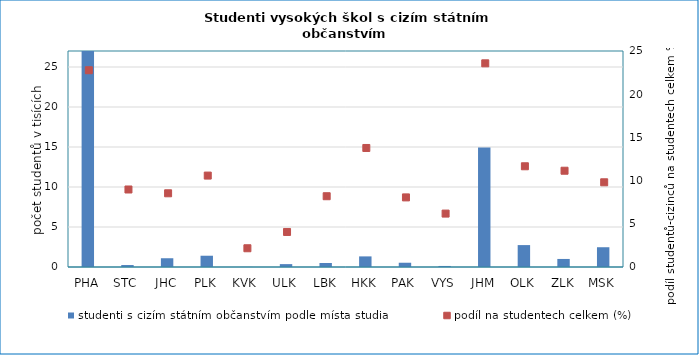
| Category | studenti s cizím státním občanstvím podle místa studia |
|---|---|
| PHA | 27759 |
| STC | 246 |
| JHC | 1095 |
| PLK | 1409 |
| KVK | 12 |
| ULK | 360 |
| LBK | 503 |
| HKK | 1326 |
| PAK | 533 |
| VYS | 130 |
| JHM | 14951 |
| OLK | 2739 |
| ZLK | 1006 |
| MSK | 2471 |